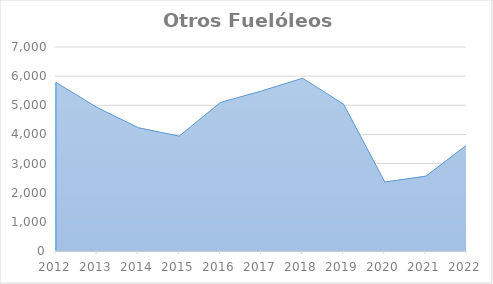
| Category | Otros Fuelóleos |
|---|---|
| 2012.0 | 5783.878 |
| 2013.0 | 4925.355 |
| 2014.0 | 4231.14 |
| 2015.0 | 3943.24 |
| 2016.0 | 5097.184 |
| 2017.0 | 5491.237 |
| 2018.0 | 5929.733 |
| 2019.0 | 5032.236 |
| 2020.0 | 2367.299 |
| 2021.0 | 2569.741 |
| 2022.0 | 3642.531 |